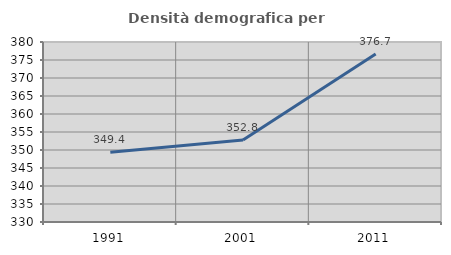
| Category | Densità demografica |
|---|---|
| 1991.0 | 349.36 |
| 2001.0 | 352.808 |
| 2011.0 | 376.676 |